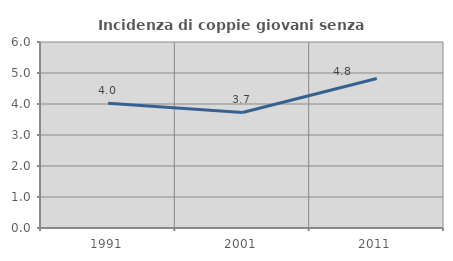
| Category | Incidenza di coppie giovani senza figli |
|---|---|
| 1991.0 | 4.028 |
| 2001.0 | 3.727 |
| 2011.0 | 4.823 |